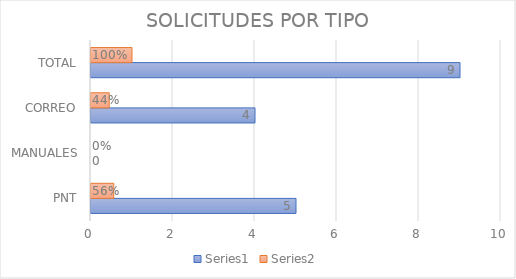
| Category | Series 0 | Series 1 |
|---|---|---|
| PNT | 5 | 0.556 |
| MANUALES | 0 | 0 |
| CORREO | 4 | 0.444 |
| TOTAL | 9 | 1 |